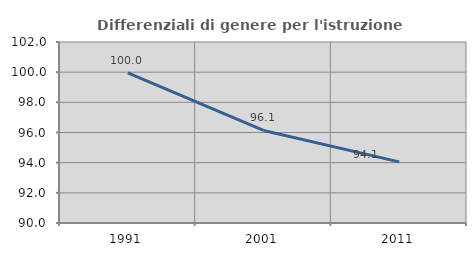
| Category | Differenziali di genere per l'istruzione superiore |
|---|---|
| 1991.0 | 99.959 |
| 2001.0 | 96.138 |
| 2011.0 | 94.052 |